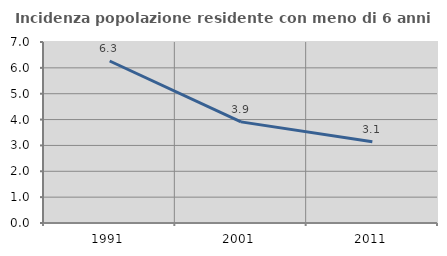
| Category | Incidenza popolazione residente con meno di 6 anni |
|---|---|
| 1991.0 | 6.265 |
| 2001.0 | 3.911 |
| 2011.0 | 3.139 |